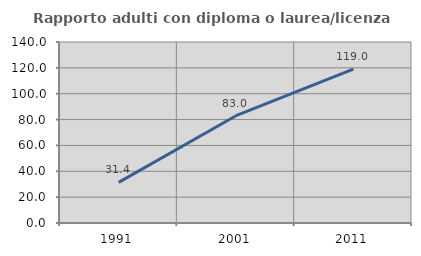
| Category | Rapporto adulti con diploma o laurea/licenza media  |
|---|---|
| 1991.0 | 31.429 |
| 2001.0 | 83 |
| 2011.0 | 119 |